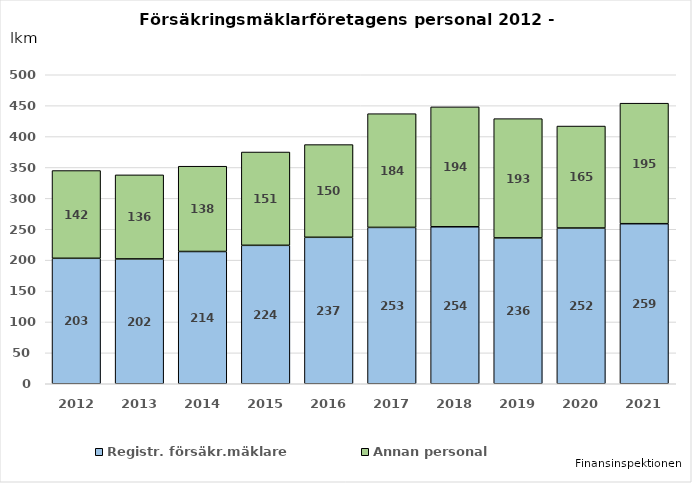
| Category | Registr. försäkr.mäklare | Annan personal |
|---|---|---|
| 2012.0 | 203 | 142 |
| 2013.0 | 202 | 136 |
| 2014.0 | 214 | 138 |
| 2015.0 | 224 | 151 |
| 2016.0 | 237 | 150 |
| 2017.0 | 253 | 184 |
| 2018.0 | 254 | 194 |
| 2019.0 | 236 | 193 |
| 2020.0 | 252 | 165 |
| 2021.0 | 259 | 195 |